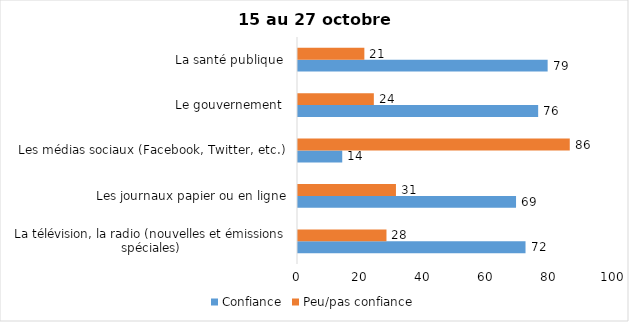
| Category | Confiance | Peu/pas confiance |
|---|---|---|
| La télévision, la radio (nouvelles et émissions spéciales) | 72 | 28 |
| Les journaux papier ou en ligne | 69 | 31 |
| Les médias sociaux (Facebook, Twitter, etc.) | 14 | 86 |
| Le gouvernement  | 76 | 24 |
| La santé publique  | 79 | 21 |